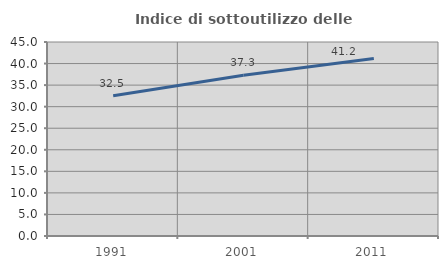
| Category | Indice di sottoutilizzo delle abitazioni  |
|---|---|
| 1991.0 | 32.548 |
| 2001.0 | 37.307 |
| 2011.0 | 41.15 |